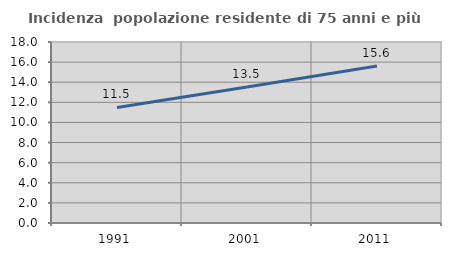
| Category | Incidenza  popolazione residente di 75 anni e più |
|---|---|
| 1991.0 | 11.489 |
| 2001.0 | 13.535 |
| 2011.0 | 15.618 |